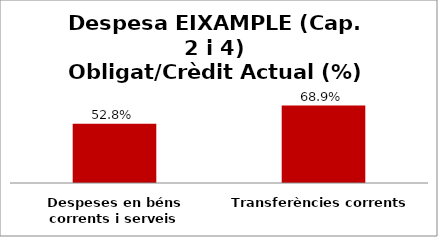
| Category | Series 0 |
|---|---|
| Despeses en béns corrents i serveis | 0.528 |
| Transferències corrents | 0.689 |